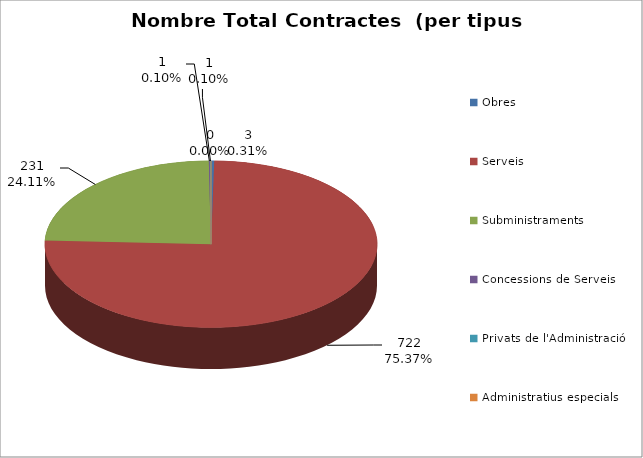
| Category | Nombre Total Contractes |
|---|---|
| Obres | 3 |
| Serveis | 722 |
| Subministraments | 231 |
| Concessions de Serveis | 1 |
| Privats de l'Administració | 1 |
| Administratius especials | 0 |